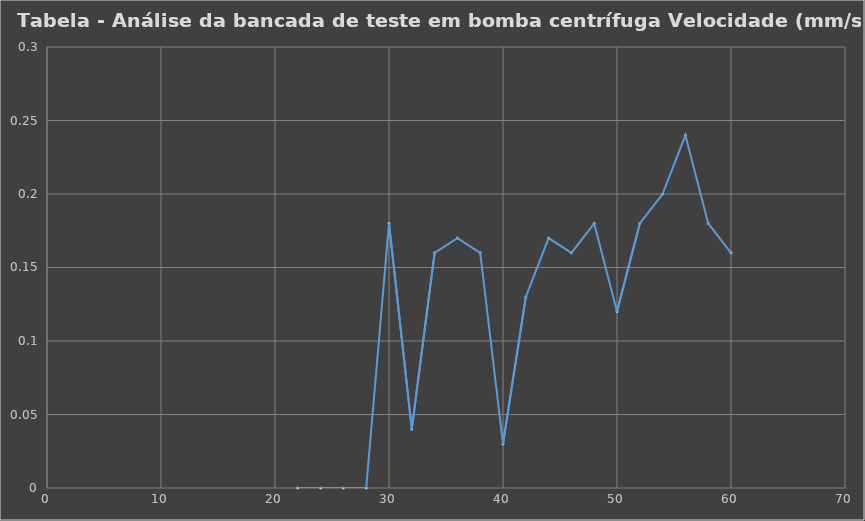
| Category | Tabela - Análise da bancada de teste em bomba centrífuga |
|---|---|
| 22.0 | 0 |
| 24.0 | 0 |
| 26.0 | 0 |
| 28.0 | 0 |
| 30.0 | 0.18 |
| 32.0 | 0.04 |
| 34.0 | 0.16 |
| 36.0 | 0.17 |
| 38.0 | 0.16 |
| 40.0 | 0.03 |
| 42.0 | 0.13 |
| 44.0 | 0.17 |
| 46.0 | 0.16 |
| 48.0 | 0.18 |
| 50.0 | 0.12 |
| 52.0 | 0.18 |
| 54.0 | 0.2 |
| 56.0 | 0.24 |
| 58.0 | 0.18 |
| 60.0 | 0.16 |